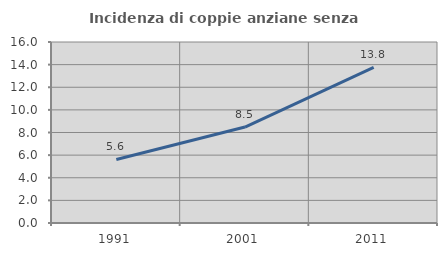
| Category | Incidenza di coppie anziane senza figli  |
|---|---|
| 1991.0 | 5.62 |
| 2001.0 | 8.482 |
| 2011.0 | 13.755 |